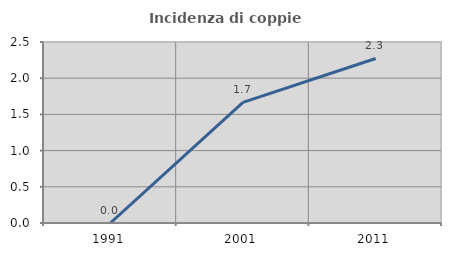
| Category | Incidenza di coppie miste |
|---|---|
| 1991.0 | 0 |
| 2001.0 | 1.667 |
| 2011.0 | 2.273 |